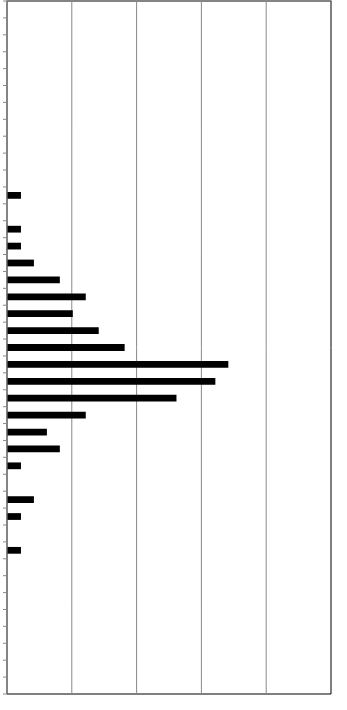
| Category | Series 0 |
|---|---|
| 0 | 0 |
| 1 | 0 |
| 2 | 0 |
| 3 | 0 |
| 4 | 0 |
| 5 | 0 |
| 6 | 0 |
| 7 | 0 |
| 8 | 0 |
| 9 | 0 |
| 10 | 0 |
| 11 | 1 |
| 12 | 0 |
| 13 | 1 |
| 14 | 1 |
| 15 | 2 |
| 16 | 4 |
| 17 | 6 |
| 18 | 5 |
| 19 | 7 |
| 20 | 9 |
| 21 | 17 |
| 22 | 16 |
| 23 | 13 |
| 24 | 6 |
| 25 | 3 |
| 26 | 4 |
| 27 | 1 |
| 28 | 0 |
| 29 | 2 |
| 30 | 1 |
| 31 | 0 |
| 32 | 1 |
| 33 | 0 |
| 34 | 0 |
| 35 | 0 |
| 36 | 0 |
| 37 | 0 |
| 38 | 0 |
| 39 | 0 |
| 40 | 0 |